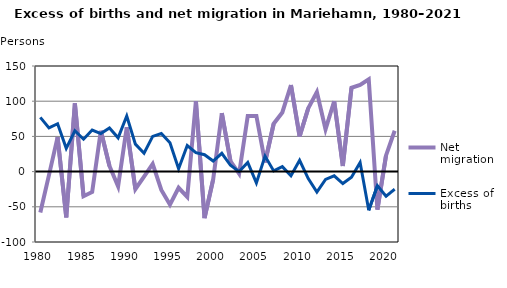
| Category | Net migration | Excess of births |
|---|---|---|
| 1980.0 | -58 | 77 |
| 1981.0 | -5 | 62 |
| 1982.0 | 49 | 68 |
| 1983.0 | -65 | 33 |
| 1984.0 | 97 | 58 |
| 1985.0 | -35 | 46 |
| 1986.0 | -29 | 59 |
| 1987.0 | 58 | 54 |
| 1988.0 | 8 | 62 |
| 1989.0 | -21 | 48 |
| 1990.0 | 63 | 79 |
| 1991.0 | -25 | 39 |
| 1992.0 | -7 | 26 |
| 1993.0 | 11 | 50 |
| 1994.0 | -26 | 54 |
| 1995.0 | -47 | 41 |
| 1996.0 | -23 | 4 |
| 1997.0 | -36 | 37 |
| 1998.0 | 100 | 27 |
| 1999.0 | -66 | 24 |
| 2000.0 | -11 | 15 |
| 2001.0 | 83 | 26 |
| 2002.0 | 15 | 9 |
| 2003.0 | -3 | 0 |
| 2004.0 | 79 | 13 |
| 2005.0 | 79 | -16 |
| 2006.0 | 13 | 22 |
| 2007.0 | 68 | 1 |
| 2008.0 | 84 | 7 |
| 2009.0 | 123 | -6 |
| 2010.0 | 50 | 16 |
| 2011.0 | 90 | -10 |
| 2012.0 | 113 | -29 |
| 2013.0 | 60 | -11 |
| 2014.0 | 100 | -6 |
| 2015.0 | 8 | -17 |
| 2016.0 | 119 | -8 |
| 2017.0 | 123 | 13 |
| 2018.0 | 131 | -55 |
| 2019.0 | -54 | -20 |
| 2020.0 | 23 | -35 |
| 2021.0 | 58 | -25 |